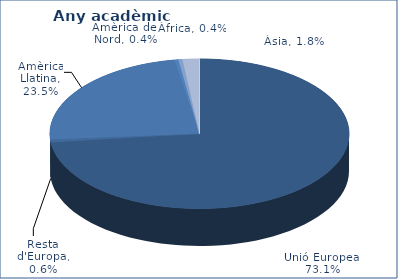
| Category | % |
|---|---|
| Unió Europea | 0.731 |
| Resta d'Europa | 0.006 |
| Amèrica Llatina | 0.235 |
| Amèrica del Nord | 0.004 |
| Àfrica | 0.004 |
| Àsia | 0.018 |
| Oceania | 0 |